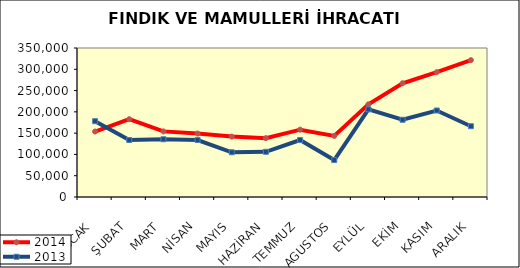
| Category | 2014 | 2013 |
|---|---|---|
| OCAK | 153795.595 | 178057.444 |
| ŞUBAT | 182753.25 | 133840.922 |
| MART | 154123.444 | 135662.814 |
| NİSAN | 149029.526 | 133846.013 |
| MAYIS | 141867.426 | 105052.596 |
| HAZİRAN | 138269.478 | 106164.207 |
| TEMMUZ | 158157.637 | 133857.603 |
| AGUSTOS | 143474.77 | 86744.865 |
| EYLÜL | 217605.668 | 205906.03 |
| EKİM | 267259.083 | 181405.018 |
| KASIM | 293193.762 | 203194.666 |
| ARALIK | 321435.281 | 166244.944 |